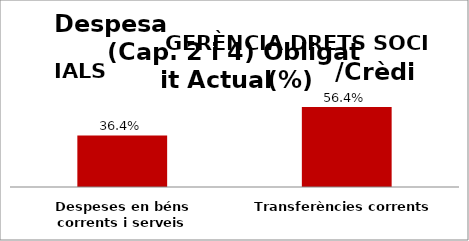
| Category | Series 0 |
|---|---|
| Despeses en béns corrents i serveis | 0.364 |
| Transferències corrents | 0.564 |